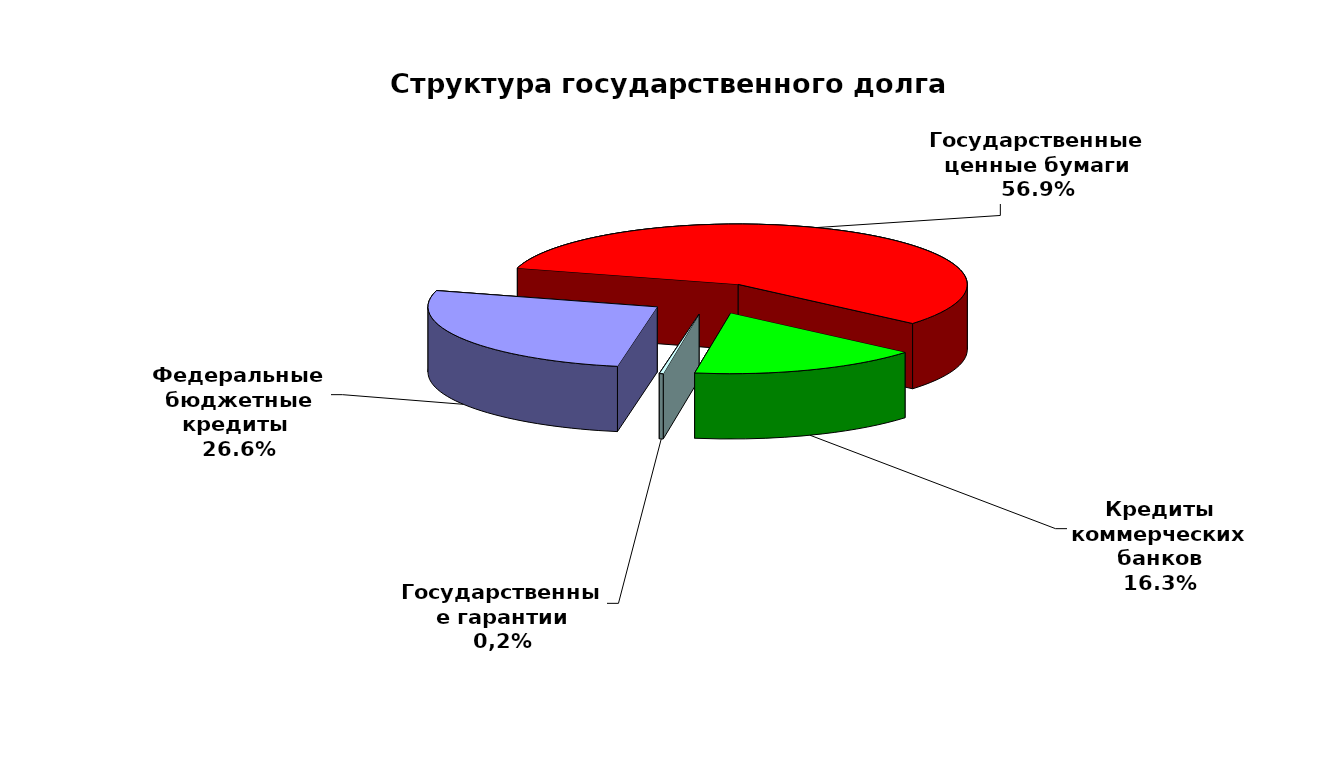
| Category | Series 0 |
|---|---|
| Федеральные бюджетные кредиты  | 19957026.213 |
| Государственные ценные бумаги | 42700000 |
| Кредиты коммерческих банков | 12219963.8 |
| Государственные гарантии | 209872.8 |